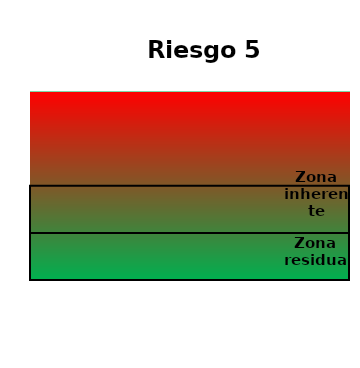
| Category | Zona  | Zona Residual | Zona inherente |
|---|---|---|---|
| Riesgo 5 | 4 | 1 | 2 |